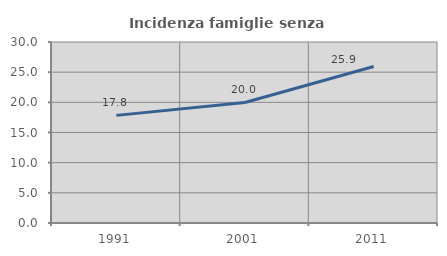
| Category | Incidenza famiglie senza nuclei |
|---|---|
| 1991.0 | 17.839 |
| 2001.0 | 19.976 |
| 2011.0 | 25.941 |